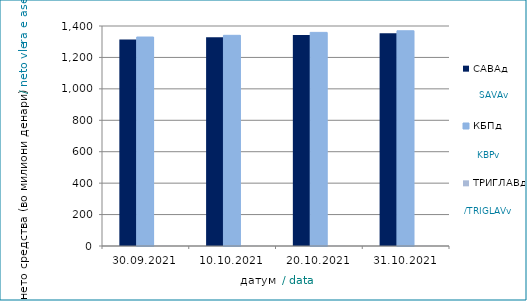
| Category | САВАд | КБПд | ТРИГЛАВд |
|---|---|---|---|
| 2021-09-30 | 1313.524 | 1329.866 | 1.147 |
| 2021-10-10 | 1328.411 | 1340.693 | 1.229 |
| 2021-10-20 | 1342.195 | 1359.36 | 1.274 |
| 2021-10-31 | 1354.602 | 1369.633 | 1.283 |